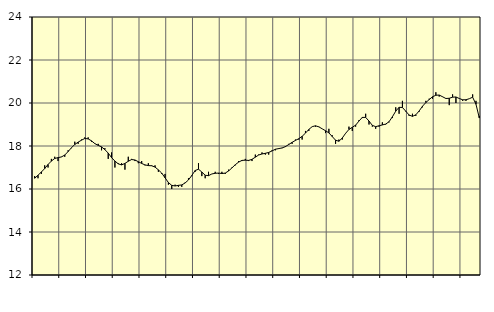
| Category | Piggar | Vård och omsorg, SNI 86-88 |
|---|---|---|
| nan | 16.6 | 16.5 |
| 87.0 | 16.5 | 16.64 |
| 87.0 | 16.7 | 16.79 |
| 87.0 | 17.1 | 16.95 |
| nan | 17 | 17.14 |
| 88.0 | 17.4 | 17.3 |
| 88.0 | 17.5 | 17.42 |
| 88.0 | 17.3 | 17.46 |
| nan | 17.5 | 17.49 |
| 89.0 | 17.5 | 17.58 |
| 89.0 | 17.8 | 17.74 |
| 89.0 | 17.9 | 17.92 |
| nan | 18.2 | 18.07 |
| 90.0 | 18.1 | 18.18 |
| 90.0 | 18.3 | 18.27 |
| 90.0 | 18.4 | 18.35 |
| nan | 18.4 | 18.33 |
| 91.0 | 18.2 | 18.24 |
| 91.0 | 18.1 | 18.11 |
| 91.0 | 18.1 | 18.03 |
| nan | 17.8 | 17.96 |
| 92.0 | 17.9 | 17.83 |
| 92.0 | 17.4 | 17.67 |
| 92.0 | 17.7 | 17.46 |
| nan | 17 | 17.3 |
| 93.0 | 17.2 | 17.17 |
| 93.0 | 17.2 | 17.12 |
| 93.0 | 16.9 | 17.19 |
| nan | 17.5 | 17.29 |
| 94.0 | 17.4 | 17.37 |
| 94.0 | 17.3 | 17.35 |
| 94.0 | 17.2 | 17.27 |
| nan | 17.3 | 17.19 |
| 95.0 | 17.1 | 17.12 |
| 95.0 | 17.2 | 17.09 |
| 95.0 | 17.1 | 17.08 |
| nan | 17.1 | 17.02 |
| 96.0 | 16.8 | 16.89 |
| 96.0 | 16.7 | 16.74 |
| 96.0 | 16.7 | 16.52 |
| nan | 16.2 | 16.3 |
| 97.0 | 16 | 16.17 |
| 97.0 | 16.2 | 16.14 |
| 97.0 | 16.1 | 16.17 |
| nan | 16.1 | 16.19 |
| 98.0 | 16.3 | 16.28 |
| 98.0 | 16.5 | 16.42 |
| 98.0 | 16.6 | 16.63 |
| nan | 16.8 | 16.86 |
| 99.0 | 17.2 | 16.92 |
| 99.0 | 16.6 | 16.79 |
| 99.0 | 16.5 | 16.64 |
| nan | 16.8 | 16.62 |
| 0.0 | 16.7 | 16.7 |
| 0.0 | 16.8 | 16.73 |
| 0.0 | 16.7 | 16.74 |
| nan | 16.8 | 16.72 |
| 1.0 | 16.7 | 16.74 |
| 1.0 | 16.9 | 16.84 |
| 1.0 | 17 | 16.98 |
| nan | 17.1 | 17.13 |
| 2.0 | 17.3 | 17.25 |
| 2.0 | 17.3 | 17.33 |
| 2.0 | 17.4 | 17.34 |
| nan | 17.3 | 17.33 |
| 3.0 | 17.3 | 17.38 |
| 3.0 | 17.6 | 17.48 |
| 3.0 | 17.6 | 17.58 |
| nan | 17.7 | 17.63 |
| 4.0 | 17.6 | 17.66 |
| 4.0 | 17.6 | 17.7 |
| 4.0 | 17.8 | 17.77 |
| nan | 17.8 | 17.85 |
| 5.0 | 17.9 | 17.88 |
| 5.0 | 17.9 | 17.91 |
| 5.0 | 18 | 17.97 |
| nan | 18.1 | 18.07 |
| 6.0 | 18.1 | 18.17 |
| 6.0 | 18.3 | 18.26 |
| 6.0 | 18.3 | 18.34 |
| nan | 18.3 | 18.45 |
| 7.0 | 18.7 | 18.6 |
| 7.0 | 18.7 | 18.77 |
| 7.0 | 18.9 | 18.9 |
| nan | 18.9 | 18.94 |
| 8.0 | 18.9 | 18.89 |
| 8.0 | 18.8 | 18.8 |
| 8.0 | 18.6 | 18.71 |
| nan | 18.8 | 18.61 |
| 9.0 | 18.5 | 18.44 |
| 9.0 | 18.1 | 18.27 |
| 9.0 | 18.3 | 18.22 |
| nan | 18.3 | 18.37 |
| 10.0 | 18.6 | 18.59 |
| 10.0 | 18.9 | 18.77 |
| 10.0 | 18.7 | 18.87 |
| nan | 18.9 | 18.97 |
| 11.0 | 19.2 | 19.16 |
| 11.0 | 19.3 | 19.33 |
| 11.0 | 19.5 | 19.33 |
| nan | 19 | 19.16 |
| 12.0 | 18.9 | 18.96 |
| 12.0 | 18.8 | 18.9 |
| 12.0 | 18.9 | 18.94 |
| nan | 19.1 | 18.98 |
| 13.0 | 19 | 19.02 |
| 13.0 | 19.1 | 19.13 |
| 13.0 | 19.3 | 19.36 |
| nan | 19.8 | 19.62 |
| 14.0 | 19.5 | 19.8 |
| 14.0 | 20.1 | 19.79 |
| 14.0 | 19.6 | 19.62 |
| nan | 19.4 | 19.44 |
| 15.0 | 19.5 | 19.38 |
| 15.0 | 19.4 | 19.45 |
| 15.0 | 19.6 | 19.63 |
| nan | 19.8 | 19.85 |
| 16.0 | 20.1 | 20.02 |
| 16.0 | 20.2 | 20.16 |
| 16.0 | 20.2 | 20.29 |
| nan | 20.5 | 20.36 |
| 17.0 | 20.3 | 20.37 |
| 17.0 | 20.3 | 20.29 |
| 17.0 | 20.2 | 20.21 |
| nan | 19.9 | 20.22 |
| 18.0 | 20.4 | 20.27 |
| 18.0 | 20 | 20.28 |
| 18.0 | 20.2 | 20.21 |
| nan | 20.1 | 20.15 |
| 19.0 | 20.1 | 20.15 |
| 19.0 | 20.2 | 20.2 |
| 19.0 | 20.4 | 20.27 |
| nan | 20.1 | 19.94 |
| 20.0 | 19.4 | 19.3 |